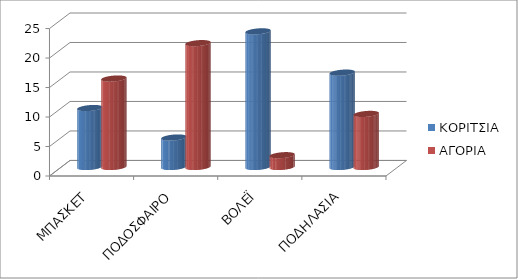
| Category | ΚΟΡΙΤΣΙΑ | ΑΓΟΡΙΑ |
|---|---|---|
| ΜΠΑΣΚΕΤ | 10 | 15 |
| ΠΟΔΟΣΦΑΙΡΟ | 5 | 21 |
| ΒΟΛΕΪ | 23 | 2 |
| ΠΟΔΗΛΑΣΙΑ | 16 | 9 |